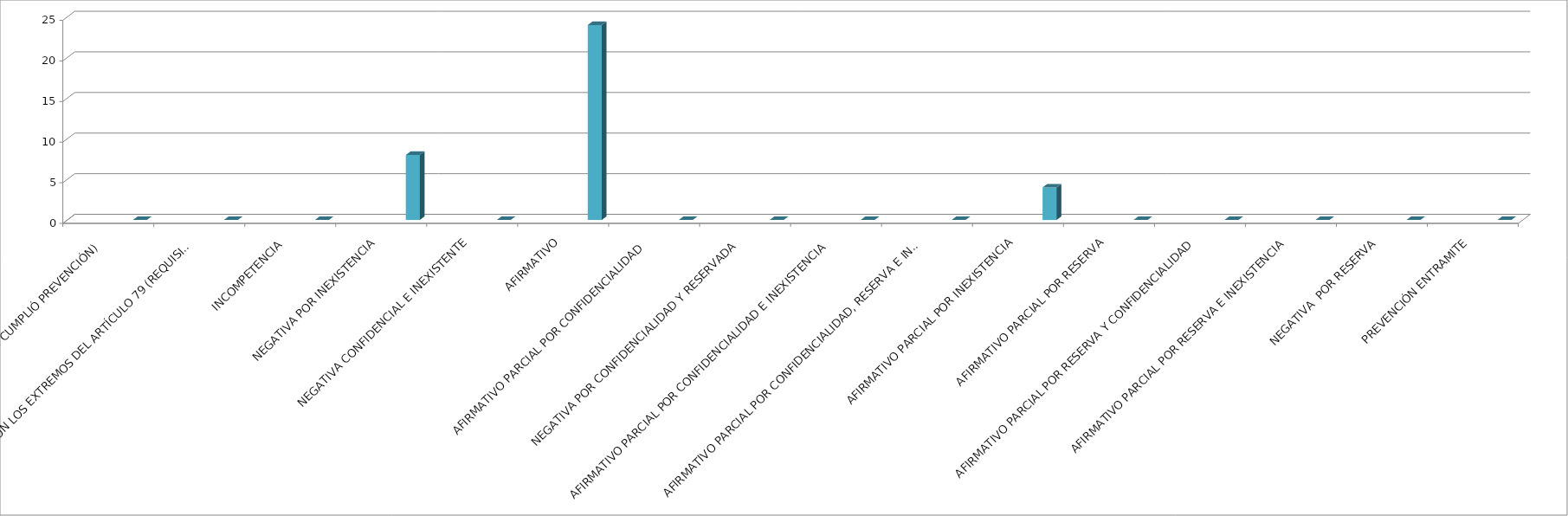
| Category | Series 0 | Series 1 | Series 2 | Series 3 | Series 4 |
|---|---|---|---|---|---|
| SE TIENE POR NO PRESENTADA ( NO CUMPLIÓ PREVENCIÓN) |  |  |  |  | 0 |
| NO CUMPLIO CON LOS EXTREMOS DEL ARTÍCULO 79 (REQUISITOS) |  |  |  |  | 0 |
| INCOMPETENCIA  |  |  |  |  | 0 |
| NEGATIVA POR INEXISTENCIA |  |  |  |  | 8 |
| NEGATIVA CONFIDENCIAL E INEXISTENTE |  |  |  |  | 0 |
| AFIRMATIVO |  |  |  |  | 24 |
| AFIRMATIVO PARCIAL POR CONFIDENCIALIDAD  |  |  |  |  | 0 |
| NEGATIVA POR CONFIDENCIALIDAD Y RESERVADA |  |  |  |  | 0 |
| AFIRMATIVO PARCIAL POR CONFIDENCIALIDAD E INEXISTENCIA |  |  |  |  | 0 |
| AFIRMATIVO PARCIAL POR CONFIDENCIALIDAD, RESERVA E INEXISTENCIA |  |  |  |  | 0 |
| AFIRMATIVO PARCIAL POR INEXISTENCIA |  |  |  |  | 4 |
| AFIRMATIVO PARCIAL POR RESERVA |  |  |  |  | 0 |
| AFIRMATIVO PARCIAL POR RESERVA Y CONFIDENCIALIDAD |  |  |  |  | 0 |
| AFIRMATIVO PARCIAL POR RESERVA E INEXISTENCIA |  |  |  |  | 0 |
| NEGATIVA  POR RESERVA |  |  |  |  | 0 |
| PREVENCIÓN ENTRAMITE |  |  |  |  | 0 |